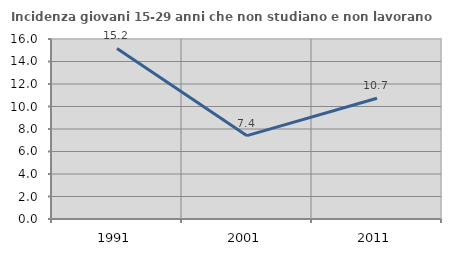
| Category | Incidenza giovani 15-29 anni che non studiano e non lavorano  |
|---|---|
| 1991.0 | 15.162 |
| 2001.0 | 7.407 |
| 2011.0 | 10.738 |